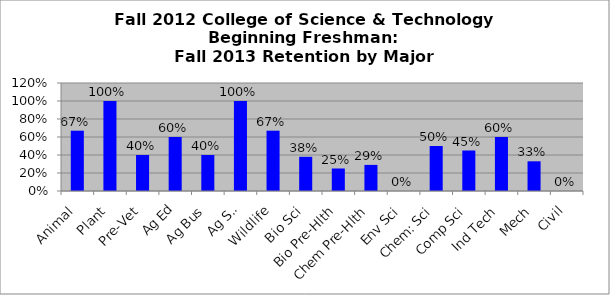
| Category | Series 0 |
|---|---|
| Animal | 0.67 |
| Plant | 1 |
| Pre-Vet | 0.4 |
| Ag Ed | 0.6 |
| Ag Bus | 0.4 |
| Ag Sci | 1 |
| Wildlife | 0.67 |
| Bio Sci | 0.38 |
| Bio Pre-Hlth | 0.25 |
| Chem Pre-Hlth | 0.29 |
| Env Sci | 0 |
| Chem: Sci | 0.5 |
| Comp Sci | 0.45 |
| Ind Tech | 0.6 |
| Mech | 0.33 |
| Civil | 0 |